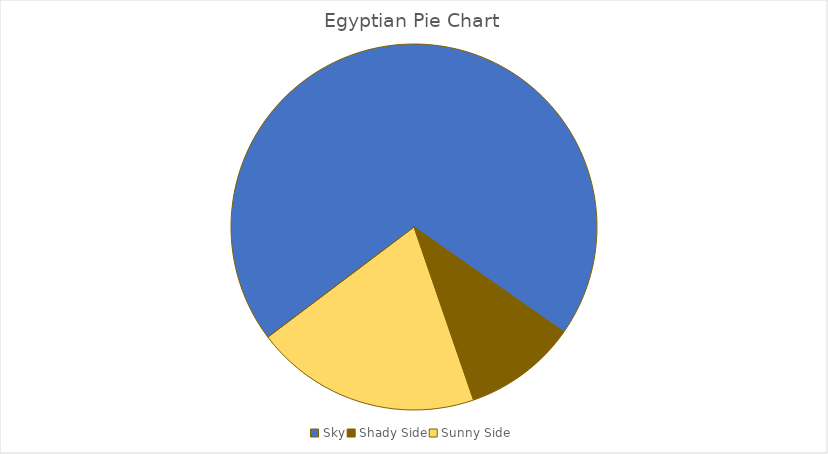
| Category | Value |
|---|---|
| Sky | 0.7 |
| Shady Side | 0.1 |
| Sunny Side | 0.2 |